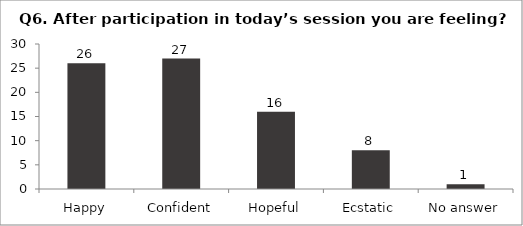
| Category | Q6. After participation in today’s session you are feeling? |
|---|---|
| Happy | 26 |
| Confident | 27 |
| Hopeful | 16 |
| Ecstatic | 8 |
| No answer | 1 |